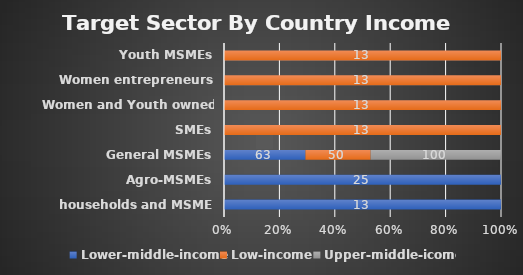
| Category | Lower-middle-income | Low-income | Upper-middle-icome |
|---|---|---|---|
|  households and MSME | 12.5 | 0 | 0 |
| Agro-MSMEs | 25 | 0 | 0 |
| General MSMEs | 62.5 | 50 | 100 |
| SMEs | 0 | 12.5 | 0 |
| Women and Youth owned MSMEs | 0 | 12.5 | 0 |
| Women entrepreneurs | 0 | 12.5 | 0 |
| Youth MSMEs | 0 | 12.5 | 0 |